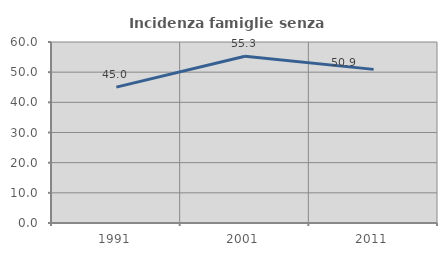
| Category | Incidenza famiglie senza nuclei |
|---|---|
| 1991.0 | 45.038 |
| 2001.0 | 55.303 |
| 2011.0 | 50.926 |